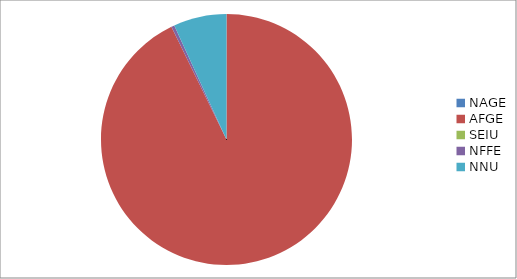
| Category | Series 0 |
|---|---|
| NAGE | 0 |
| AFGE | 26125 |
| SEIU | 0 |
| NFFE | 114 |
| NNU | 1924 |